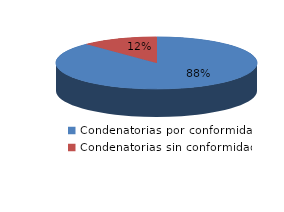
| Category | Series 0 |
|---|---|
| 0 | 2137 |
| 1 | 298 |